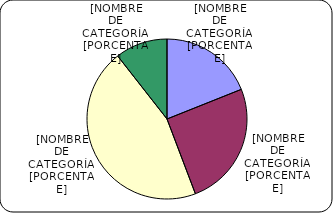
| Category | Series 0 |
|---|---|
| Entre 1-5 años | 2352.6 |
| Entre 6-10 años | 3135.8 |
| Entre 11-20 años | 5610.1 |
| Mayores de 20 años | 1312.2 |